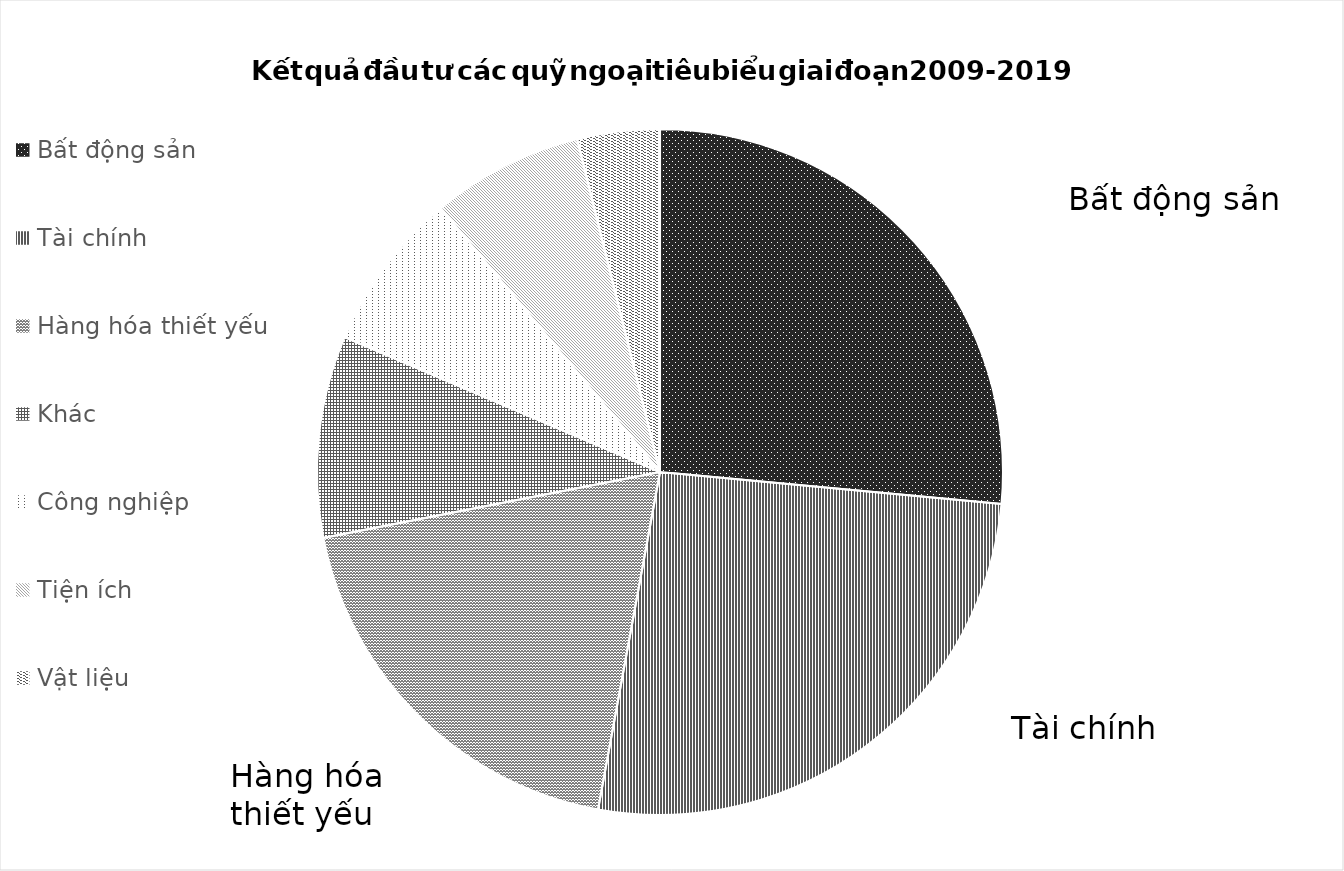
| Category | 07/02/2019 |
|---|---|
| Ngành  | 0 |
| Bất động sản | 0.265 |
| Tài chính | 0.264 |
| Hàng hóa thiết yếu | 0.19 |
| Khác | 0.095 |
| Công nghiệp | 0.075 |
| Tiện ích | 0.072 |
| Vật liệu | 0.039 |